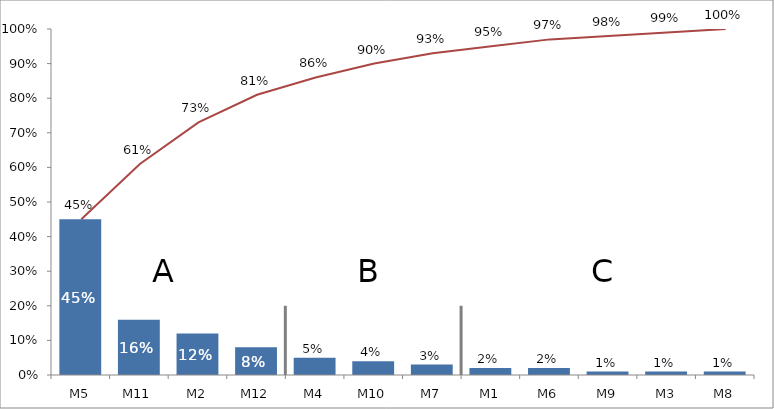
| Category | Columns |
|---|---|
| M5 | 0.45 |
| M11 | 0.16 |
| M2 | 0.12 |
| M12 | 0.08 |
| M4 | 0.05 |
| M10 | 0.04 |
| M7 | 0.03 |
| M1 | 0.02 |
| M6 | 0.02 |
| M9 | 0.01 |
| M3 | 0.01 |
| M8 | 0.01 |